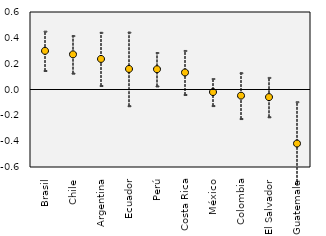
| Category | ub | lb | type1 |
|---|---|---|---|
| Brasil | 0.452 | 0.147 | 0.299 |
| Chile | 0.417 | 0.127 | 0.272 |
| Argentina | 0.442 | 0.031 | 0.237 |
| Ecuador | 0.444 | -0.126 | 0.159 |
| Perú | 0.286 | 0.028 | 0.157 |
| Costa Rica | 0.302 | -0.038 | 0.132 |
| México | 0.085 | -0.124 | -0.02 |
| Colombia | 0.13 | -0.225 | -0.048 |
| El Salvador | 0.093 | -0.211 | -0.059 |
| Guatemala | -0.094 | -0.742 | -0.418 |